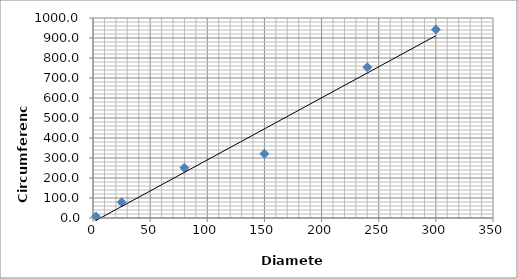
| Category | Series 0 |
|---|---|
| 2.5 | 7.854 |
| 25.0 | 78.54 |
| 80.0 | 251.327 |
| 150.0 | 321.239 |
| 240.0 | 753.982 |
| 300.0 | 942.478 |